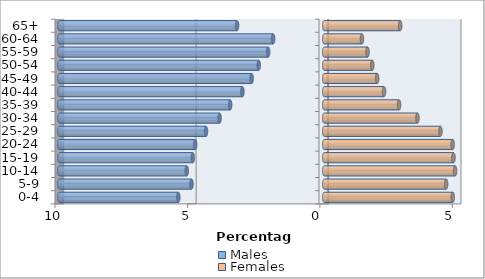
| Category | Males | Females |
|---|---|---|
| 0-4 | -5.509 | 4.852 |
| 5-9 | -5.01 | 4.603 |
| 10-14 | -5.189 | 4.941 |
| 15-19 | -4.961 | 4.88 |
| 20-24 | -4.873 | 4.85 |
| 25-29 | -4.462 | 4.388 |
| 30-34 | -3.95 | 3.52 |
| 35-39 | -3.551 | 2.825 |
| 40-44 | -3.089 | 2.259 |
| 45-49 | -2.74 | 1.999 |
| 50-54 | -2.472 | 1.814 |
| 55-59 | -2.118 | 1.634 |
| 60-64 | -1.93 | 1.424 |
| 65+ | -3.29 | 2.868 |